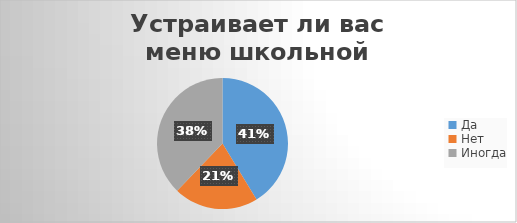
| Category | Series 0 |
|---|---|
| Да | 95 |
| Нет | 48 |
| Иногда | 87 |